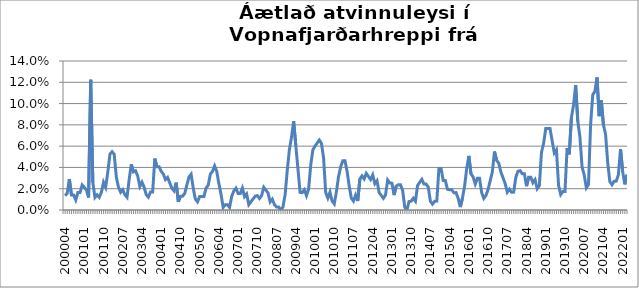
| Category | Series 0 |
|---|---|
| 200004 | 0.013 |
| 200005 | 0.016 |
| 200006 | 0.029 |
| 200007 | 0.014 |
| 200008 | 0.014 |
| 200009 | 0.009 |
| 200010 | 0.016 |
| 200011 | 0.016 |
| 200012 | 0.023 |
| 200101 | 0.021 |
| 200102 | 0.019 |
| 200103 | 0.012 |
| 200104 | 0.122 |
| 200105 | 0.026 |
| 200106 | 0.012 |
| 200107 | 0.014 |
| 200108 | 0.012 |
| 200109 | 0.017 |
| 200110 | 0.026 |
| 200111 | 0.021 |
| 200112 | 0.036 |
| 200201 | 0.052 |
| 200202 | 0.055 |
| 200203 | 0.052 |
| 200204 | 0.031 |
| 200205 | 0.021 |
| 200206 | 0.017 |
| 200207 | 0.019 |
| 200208 | 0.014 |
| 200209 | 0.012 |
| 200210 | 0.029 |
| 200211 | 0.043 |
| 200212 | 0.036 |
| 200301 | 0.037 |
| 200302 | 0.032 |
| 200303 | 0.022 |
| 200304 | 0.026 |
| 200305 | 0.021 |
| 200306 | 0.014 |
| 200307 | 0.012 |
| 200308 | 0.017 |
| 200309 | 0.017 |
| 200310 | 0.048 |
| 200311 | 0.041 |
| 200312 | 0.041 |
| 200401 | 0.036 |
| 200402 | 0.034 |
| 200403 | 0.029 |
| 200404 | 0.031 |
| 200405 | 0.026 |
| 200406 | 0.02 |
| 200407 | 0.018 |
| 200408 | 0.026 |
| 200409 | 0.008 |
| 200410 | 0.013 |
| 200411 | 0.013 |
| 200412 | 0.016 |
| 200501 | 0.023 |
| 200502 | 0.031 |
| 200503 | 0.034 |
| 200504 | 0.02 |
| 200505 | 0.01 |
| 200506 | 0.008 |
| 200507 | 0.013 |
| 200508 | 0.013 |
| 200509 | 0.013 |
| 200510 | 0.021 |
| 200511 | 0.023 |
| 200512 | 0.034 |
| 200601 | 0.036 |
| 200602 | 0.041 |
| 200603 | 0.036 |
| 200604 | 0.025 |
| 200605 | 0.015 |
| 200606 | 0.002 |
| 200607 | 0.005 |
| 200608 | 0.005 |
| 200609 | 0.002 |
| 200610 | 0.013 |
| 200611 | 0.018 |
| 200612 | 0.021 |
| 200701 | 0.016 |
| 200702 | 0.016 |
| 200703 | 0.021 |
| 200704 | 0.013 |
| 200705 | 0.015 |
| 200706 | 0.005 |
| 200707 | 0.008 |
| 200708 | 0.01 |
| 200709 | 0.013 |
| 200710 | 0.014 |
| 200711 | 0.011 |
| 200712 | 0.014 |
| 200801 | 0.021 |
| 200802 | 0.019 |
| 200803 | 0.016 |
| 200804 | 0.008 |
| 200805 | 0.01 |
| 200806 | 0.005 |
| 200807 | 0.003 |
| 200808 | 0.003 |
| 200809 | 0 |
| 200810 | 0.003 |
| 200811 | 0.014 |
| 200812 | 0.037 |
| 200901 | 0.057 |
| 200902 | 0.068 |
| 200903 | 0.083 |
| 200904 | 0.061 |
| 200905 | 0.039 |
| 200906 | 0.017 |
| 200907 | 0.016 |
| 200908 | 0.019 |
| 200909 | 0.014 |
| 200910 | 0.02 |
| 200911 | 0.042 |
| 200912 | 0.056 |
| 201001 | 0.06 |
| 201002 | 0.063 |
| 201003 | 0.066 |
| 201004 | 0.063 |
| 201005 | 0.049 |
| 201006 | 0.016 |
| 201007 | 0.011 |
| 201008 | 0.017 |
| 201009 | 0.008 |
| 201010 | 0.006 |
| 201011 | 0.017 |
| 201012 | 0.031 |
| 201101 | 0.04 |
| 201102 | 0.046 |
| 201103 | 0.046 |
| 201104 | 0.036 |
| 201105 | 0.022 |
| 201106 | 0.011 |
| 201107 | 0.008 |
| 201108 | 0.014 |
| 201109 | 0.008 |
| 201110 | 0.029 |
| 201111 | 0.032 |
| 201112 | 0.029 |
| 201201 | 0.034 |
| 201202 | 0.032 |
| 201203 | 0.029 |
| 201204 | 0.033 |
| 201205 | 0.025 |
| 201206 | 0.027 |
| 201207 | 0.016 |
| 201208 | 0.014 |
| 201209 | 0.011 |
| 201210 | 0.014 |
| 201211 | 0.028 |
| 201212 | 0.025 |
| 201301 | 0.025 |
| 201302 | 0.014 |
| 201303 | 0.022 |
| 201304 | 0.024 |
| 201305 | 0.024 |
| 201306 | 0.018 |
| 201307 | 0.003 |
| 201308 | 0 |
| 201309 | 0.008 |
| 201310 | 0.008 |
| 201311 | 0.011 |
| 201312 | 0.008 |
| 201401 | 0.023 |
| 201402 | 0.026 |
| 201403 | 0.029 |
| 201404 | 0.024 |
| 201405 | 0.024 |
| 201406 | 0.022 |
| 201407 | 0.008 |
| 201408 | 0.005 |
| 201409 | 0.008 |
| 201410 | 0.008 |
| 201411 | 0.039 |
| 201412 | 0.039 |
| 201501 | 0.028 |
| 201502 | 0.028 |
| 201503 | 0.019 |
| 201504 | 0.019 |
| 201505 | 0.019 |
| 201506 | 0.016 |
| 201507 | 0.016 |
| 201508 | 0.011 |
| 201509 | 0.003 |
| 201510 | 0.011 |
| 201511 | 0.022 |
| 201512 | 0.039 |
| 201601 | 0.051 |
| 201602 | 0.034 |
| 201603 | 0.031 |
| 201604 | 0.024 |
| 201605 | 0.03 |
| 201606 | 0.03 |
| 201607 | 0.016 |
| 201608 | 0.011 |
| 201609 | 0.014 |
| 201610 | 0.019 |
| 201611 | 0.028 |
| 201612 | 0.036 |
| 201701 | 0.055 |
| 201702 | 0.047 |
| 201703 | 0.044 |
| 201704 | 0.036 |
| 201705 | 0.03 |
| 201706 | 0.025 |
| 201707 | 0.017 |
| 201708 | 0.019 |
| 201709 | 0.017 |
| 201710 | 0.017 |
| 201711 | 0.031 |
| 201712 | 0.036 |
| 201801 | 0.037 |
| 201802 | 0.034 |
| 201803 | 0.034 |
| 201804 | 0.022 |
| 201805 | 0.031 |
| 201806 | 0.031 |
| 201807 | 0.026 |
| 201808 | 0.028 |
| 201809 | 0.02 |
| 201810 | 0.023 |
| 201811 | 0.054 |
| 201812 | 0.063 |
| 201901 | 0.076 |
| 201902 | 0.076 |
| 201903 | 0.076 |
| 201904 | 0.065 |
| 201905 | 0.054 |
| 201906 | 0.056 |
| 201907 | 0.023 |
| 201908 | 0.014 |
| 201909 | 0.017 |
| 201910 | 0.017 |
| 201911 | 0.058 |
| 201912 | 0.052 |
| 202001 | 0.086 |
| 202002 | 0.099 |
| 202003*** | 0.117 |
| 202004 | 0.083 |
| 202005 | 0.069 |
| 202006 | 0.04 |
| 202007 | 0.033 |
| 202008 | 0.021 |
| 202009 | 0.024 |
| 202010 | 0.08 |
| 202011 | 0.108 |
| 202012 | 0.111 |
| 202101 | 0.125 |
| 202102 | 0.088 |
| 202103 | 0.103 |
| 202104 | 0.08 |
| 202105 | 0.071 |
| 202106 | 0.045 |
| 202107 | 0.027 |
| 202108 | 0.024 |
| 202109 | 0.027 |
| 202110 | 0.027 |
| 202111 | 0.033 |
| 202112 | 0.057 |
| 202201 | 0.036 |
| 202202 | 0.024 |
| 202203 | 0.033 |